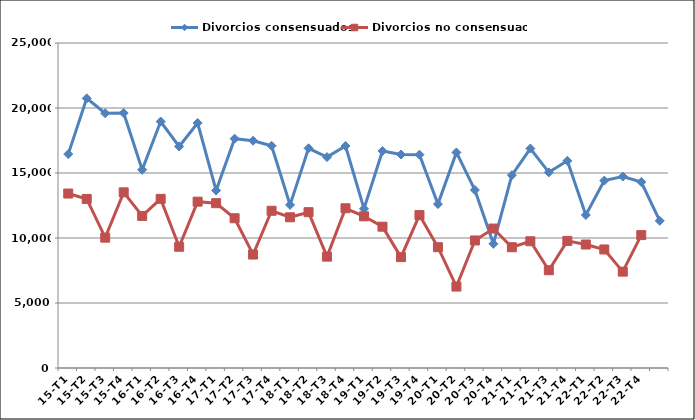
| Category | Divorcios consensuados | Divorcios no consensuados |
|---|---|---|
| 15-T1 | 16454 | 13420 |
| 15-T2 | 20739 | 13004 |
| 15-T3 | 19595 | 10027 |
| 15-T4 | 19612 | 13512 |
| 16-T1 | 15249 | 11699 |
| 16-T2 | 18958 | 13011 |
| 16-T3 | 17041 | 9325 |
| 16-T4 | 18847 | 12795 |
| 17-T1 | 13660 | 12679 |
| 17-T2 | 17641 | 11520 |
| 17-T3 | 17483 | 8727 |
| 17-T4 | 17095 | 12093 |
| 18-T1 | 12545 | 11594 |
| 18-T2 | 16901 | 11986 |
| 18-T3 | 16226 | 8566 |
| 18-T4 | 17077 | 12287 |
| 19-T1 | 12249 | 11668 |
| 19-T2 | 16689 | 10869 |
| 19-T3 | 16423 | 8528 |
| 19-T4 | 16409 | 11761 |
| 20-T1 | 12607 | 9290 |
| 20-T2 | 16581 | 6264 |
| 20-T3 | 13690 | 9809 |
| 20-T4 | 9552 | 10727 |
| 21-T1 | 14835 | 9290 |
| 21-T2 | 16883 | 9750 |
| 21-T3 | 15048 | 7520 |
| 21-T4 | 15937 | 9777 |
| 22-T1 | 11767 | 9498 |
| 22-T2 | 14416 | 9118 |
| 22-T3 | 14730 | 7413 |
| 22-T4 | 14306 | 10224 |